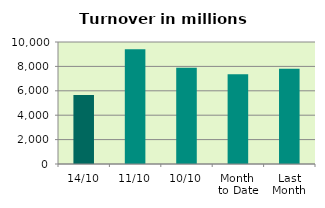
| Category | Series 0 |
|---|---|
| 14/10 | 5656.41 |
| 11/10 | 9406.337 |
| 10/10 | 7891.081 |
| Month 
to Date | 7353.283 |
| Last
Month | 7802.515 |